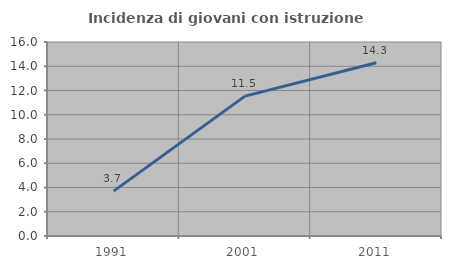
| Category | Incidenza di giovani con istruzione universitaria |
|---|---|
| 1991.0 | 3.704 |
| 2001.0 | 11.538 |
| 2011.0 | 14.286 |